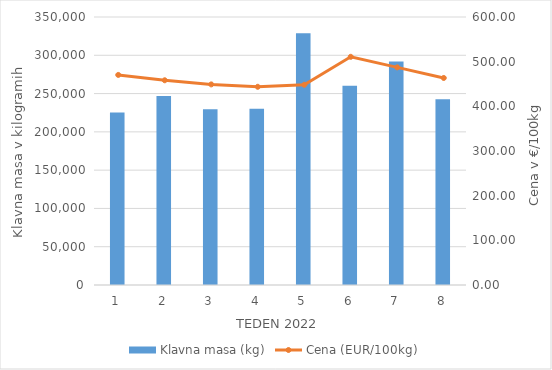
| Category | Klavna masa (kg) |
|---|---|
| 1.0 | 225300 |
| 2.0 | 246712 |
| 3.0 | 229541 |
| 4.0 | 230074 |
| 5.0 | 328640 |
| 6.0 | 260108 |
| 7.0 | 291887 |
| 8.0 | 242732 |